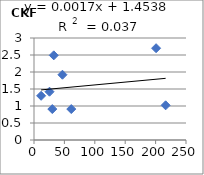
| Category | CKF |
|---|---|
| 25.5 | 1.42 |
| 61.3 | 0.91 |
| 11.7 | 1.3 |
| 216.5 | 1.02 |
| 46.8 | 1.92 |
| 32.5 | 2.49 |
| 200.8 | 2.7 |
| 30.1 | 0.91 |